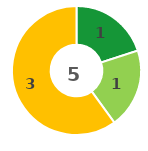
| Category | Series 0 |
|---|---|
| 0 | 1 |
| 1 | 1 |
| 2 | 3 |
| 3 | 0 |
| 4 | 0 |